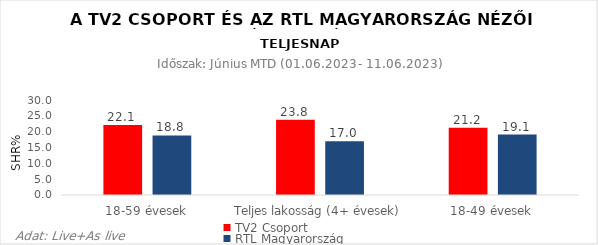
| Category | TV2 Csoport | RTL Magyarország |
|---|---|---|
| 18-59 évesek | 22.1 | 18.8 |
| Teljes lakosság (4+ évesek) | 23.8 | 17 |
| 18-49 évesek | 21.2 | 19.1 |